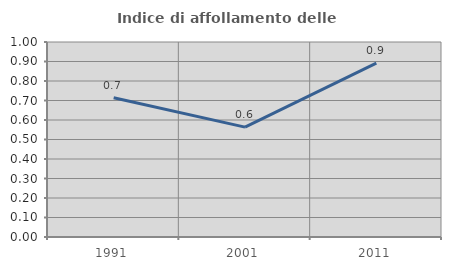
| Category | Indice di affollamento delle abitazioni  |
|---|---|
| 1991.0 | 0.714 |
| 2001.0 | 0.563 |
| 2011.0 | 0.892 |